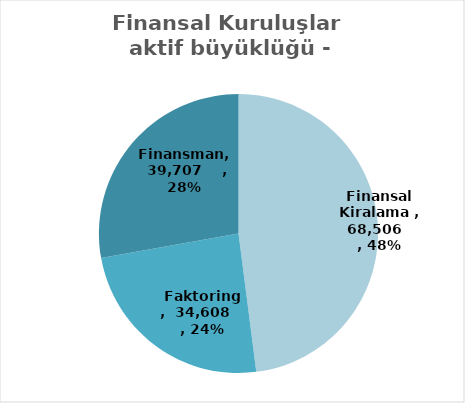
| Category | Series 0 |
|---|---|
| Finansal Kiralama  | 68506 |
| Faktoring  | 34608 |
| Finansman | 39707 |